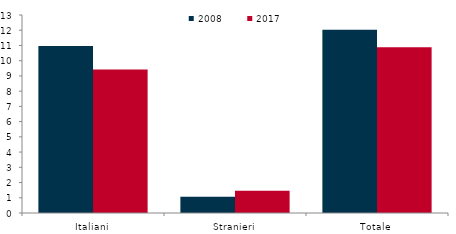
| Category | 2008 | 2017 |
|---|---|---|
| Italiani | 10.971 | 9.419 |
| Stranieri | 1.061 | 1.459 |
| Totale | 12.034 | 10.877 |